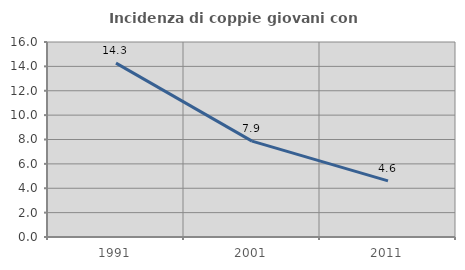
| Category | Incidenza di coppie giovani con figli |
|---|---|
| 1991.0 | 14.268 |
| 2001.0 | 7.866 |
| 2011.0 | 4.607 |